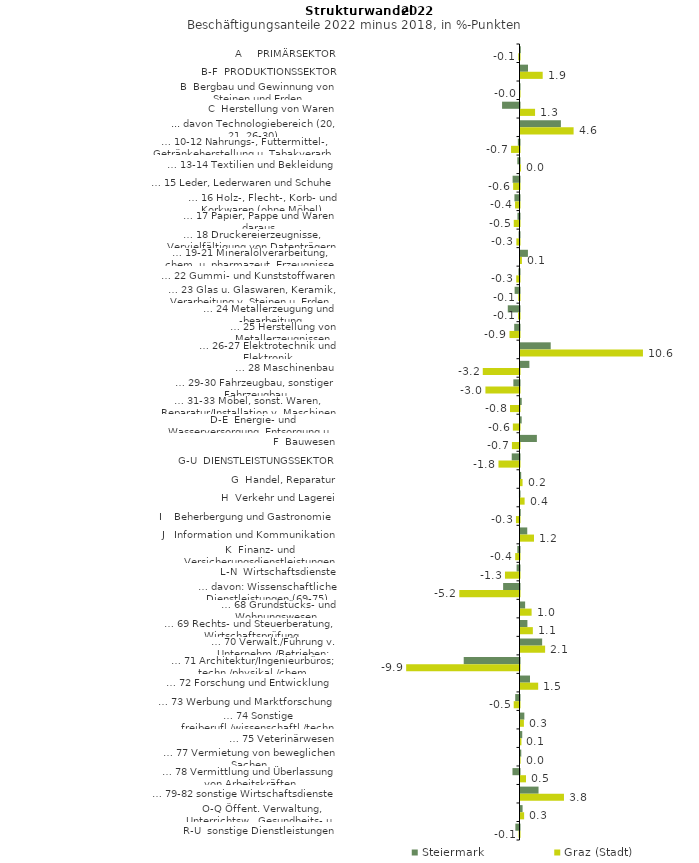
| Category | Steiermark | Graz (Stadt) |
|---|---|---|
| A     PRIMÄRSEKTOR | 0.025 | -0.101 |
| B-F  PRODUKTIONSSEKTOR | 0.65 | 1.93 |
| B  Bergbau und Gewinnung von Steinen und Erden | -0.011 | -0.029 |
| C  Herstellung von Waren | -1.516 | 1.267 |
| ... davon Technologiebereich (20, 21, 26-30) | 3.513 | 4.618 |
| … 10-12 Nahrungs-, Futtermittel-, Getränkeherstellung u. Tabakverarb. | -0.143 | -0.736 |
| … 13-14 Textilien und Bekleidung | -0.189 | 0.036 |
| … 15 Leder, Lederwaren und Schuhe | -0.6 | -0.554 |
| … 16 Holz-, Flecht-, Korb- und Korkwaren (ohne Möbel)  | -0.44 | -0.388 |
| … 17 Papier, Pappe und Waren daraus  | -0.178 | -0.5 |
| … 18 Druckereierzeugnisse, Vervielfältigung von Datenträgern | -0.077 | -0.272 |
| … 19-21 Mineralölverarbeitung, chem. u. pharmazeut. Erzeugnisse | 0.646 | 0.123 |
| … 22 Gummi- und Kunststoffwaren | -0.089 | -0.284 |
| … 23 Glas u. Glaswaren, Keramik, Verarbeitung v. Steinen u. Erden  | -0.424 | -0.106 |
| … 24 Metallerzeugung und -bearbeitung | -1.019 | -0.122 |
| … 25 Herstellung von Metallerzeugnissen  | -0.459 | -0.871 |
| … 26-27 Elektrotechnik und Elektronik | 2.628 | 10.648 |
| … 28 Maschinenbau | 0.773 | -3.193 |
| … 29-30 Fahrzeugbau, sonstiger Fahrzeugbau | -0.534 | -2.963 |
| … 31-33 Möbel, sonst. Waren, Reparatur/Installation v. Maschinen | 0.106 | -0.825 |
| D-E  Energie- und Wasserversorgung, Entsorgung u. Rückgewinnung | 0.102 | -0.577 |
| F  Bauwesen | 1.424 | -0.658 |
| G-U  DIENSTLEISTUNGSSEKTOR | -0.676 | -1.829 |
| G  Handel, Reparatur | 0.059 | 0.18 |
| H  Verkehr und Lagerei | -0.05 | 0.357 |
| I    Beherbergung und Gastronomie | 0.02 | -0.307 |
| J   Information und Kommunikation | 0.588 | 1.174 |
| K  Finanz- und Versicherungsdienstleistungen | -0.188 | -0.374 |
| L-N  Wirtschaftsdienste | -0.252 | -1.264 |
| … davon: Wissenschaftliche Dienstleistungen (69-75) | -1.425 | -5.235 |
| … 68 Grundstücks- und Wohnungswesen  | 0.402 | 0.966 |
| … 69 Rechts- und Steuerberatung, Wirtschaftsprüfung | 0.6 | 1.074 |
| … 70 Verwalt./Führung v. Unternehm./Betrieben; Unternehmensberat. | 1.883 | 2.14 |
| … 71 Architektur/Ingenieurbüros; techn./physikal./chem. Untersuchung | -4.85 | -9.856 |
| … 72 Forschung und Entwicklung  | 0.828 | 1.537 |
| … 73 Werbung und Marktforschung | -0.372 | -0.503 |
| … 74 Sonstige freiberufl./wissenschaftl./techn. Tätigkeiten | 0.334 | 0.297 |
| … 75 Veterinärwesen | 0.152 | 0.081 |
| … 77 Vermietung von beweglichen Sachen  | 0.067 | 0.009 |
| … 78 Vermittlung und Überlassung von Arbeitskräften | -0.611 | 0.48 |
| … 79-82 sonstige Wirtschaftsdienste | 1.569 | 3.78 |
| O-Q Öffent. Verwaltung, Unterrichtsw., Gesundheits- u. Sozialwesen | 0.182 | 0.315 |
| R-U  sonstige Dienstleistungen | -0.359 | -0.079 |